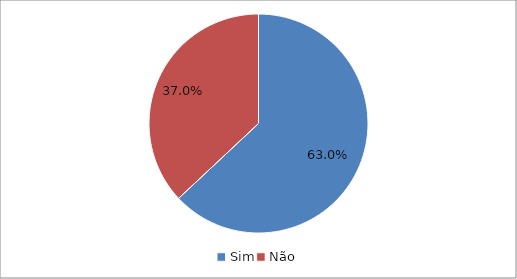
| Category | Series 0 |
|---|---|
| Sim | 0.63 |
| Não | 0.37 |